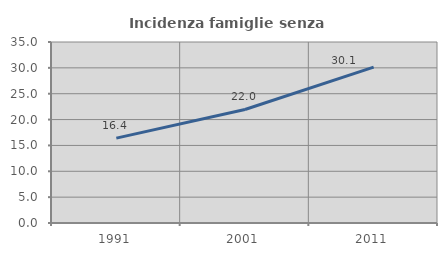
| Category | Incidenza famiglie senza nuclei |
|---|---|
| 1991.0 | 16.419 |
| 2001.0 | 21.956 |
| 2011.0 | 30.138 |